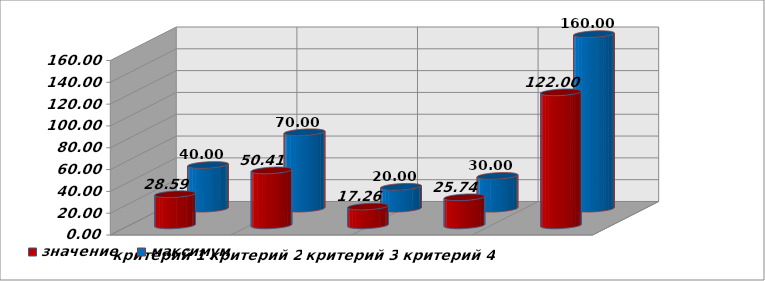
| Category | значение | максимум |
|---|---|---|
| критерий 1 | 28.587 | 40 |
| критерий 2 | 50.414 | 70 |
| критерий 3 | 17.265 | 20 |
| критерий 4 | 25.737 | 30 |